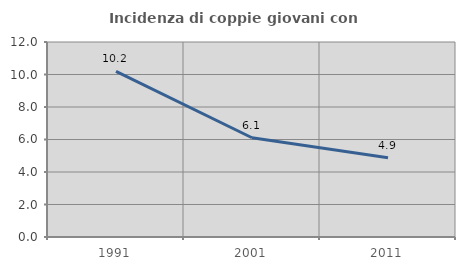
| Category | Incidenza di coppie giovani con figli |
|---|---|
| 1991.0 | 10.19 |
| 2001.0 | 6.108 |
| 2011.0 | 4.883 |